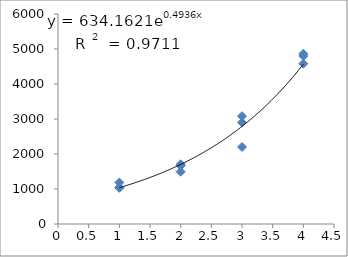
| Category | Series 0 |
|---|---|
| 1.0 | 1186 |
| 1.0 | 1034 |
| 1.0 | 1044 |
| 2.0 | 1705 |
| 2.0 | 1495 |
| 2.0 | 1665 |
| 3.0 | 2200 |
| 3.0 | 3080 |
| 3.0 | 2900 |
| 4.0 | 4865 |
| 4.0 | 4580 |
| 4.0 | 4800 |